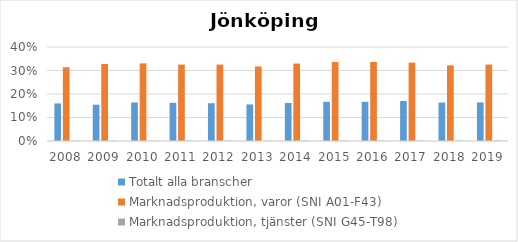
| Category | Totalt alla branscher | Marknadsproduktion, varor (SNI A01-F43) | Marknadsproduktion, tjänster (SNI G45-T98) |
|---|---|---|---|
| 2008 | 0.16 | 0.314 | 0.002 |
| 2009 | 0.154 | 0.328 | 0.001 |
| 2010 | 0.164 | 0.33 | 0.001 |
| 2011 | 0.163 | 0.325 | 0.002 |
| 2012 | 0.161 | 0.325 | 0.002 |
| 2013 | 0.156 | 0.317 | 0.002 |
| 2014 | 0.162 | 0.33 | 0.002 |
| 2015 | 0.167 | 0.337 | 0.002 |
| 2016 | 0.167 | 0.337 | 0.002 |
| 2017 | 0.17 | 0.334 | 0.002 |
| 2018 | 0.164 | 0.322 | 0.002 |
| 2019 | 0.164 | 0.325 | 0.002 |